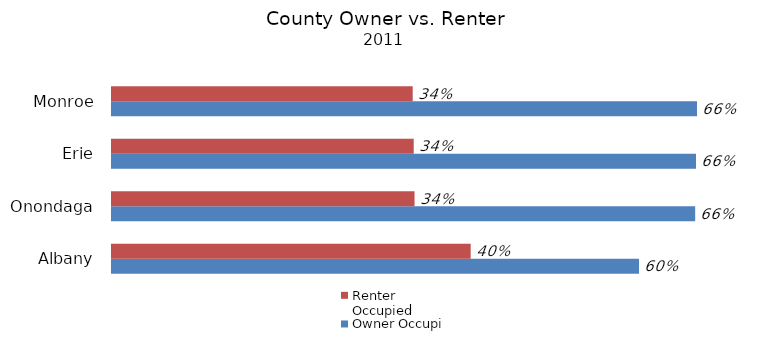
| Category | Owner Occupied | Renter Occupied |
|---|---|---|
| Albany | 0.595 | 0.405 |
| Onondaga | 0.658 | 0.342 |
| Erie | 0.659 | 0.341 |
| Monroe | 0.66 | 0.34 |